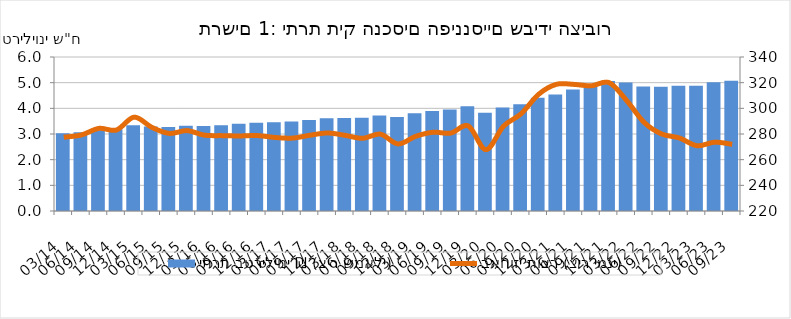
| Category | יתרת בטריליוני ₪ (ציר שמאלי) |
|---|---|
| 2014-03-31 | 3030.51 |
| 2014-06-30 | 3068.32 |
| 2014-09-30 | 3150.23 |
| 2014-12-31 | 3182.07 |
| 2015-03-31 | 3341.02 |
| 2015-06-30 | 3295.9 |
| 2015-09-30 | 3269.99 |
| 2015-12-31 | 3325.83 |
| 2016-03-31 | 3312.83 |
| 2016-06-30 | 3339.68 |
| 2016-09-30 | 3395.51 |
| 2016-12-31 | 3436.6 |
| 2017-03-31 | 3454.91 |
| 2017-06-30 | 3488.08 |
| 2017-09-30 | 3544.53 |
| 2017-12-31 | 3610.36 |
| 2018-03-31 | 3627.61 |
| 2018-06-30 | 3634.49 |
| 2018-09-30 | 3717.59 |
| 2018-12-31 | 3667.07 |
| 2019-03-31 | 3807.85 |
| 2019-06-30 | 3898.88 |
| 2019-09-30 | 3955.55 |
| 2019-12-31 | 4077.77 |
| 2020-03-31 | 3826.15 |
| 2020-06-30 | 4028.67 |
| 2020-09-30 | 4163.95 |
| 2020-12-31 | 4407.75 |
| 2021-03-31 | 4537.98 |
| 2021-06-30 | 4733.62 |
| 2021-09-30 | 4840.12 |
| 2021-12-31 | 5062.41 |
| 2022-03-31 | 5010.19 |
| 2022-06-30 | 4853.09 |
| 2022-09-30 | 4836.72 |
| 2022-12-31 | 4884.06 |
| 2023-03-31 | 4875.23 |
| 2023-06-30 | 5012.67 |
| 2023-09-30 | 5071.71 |